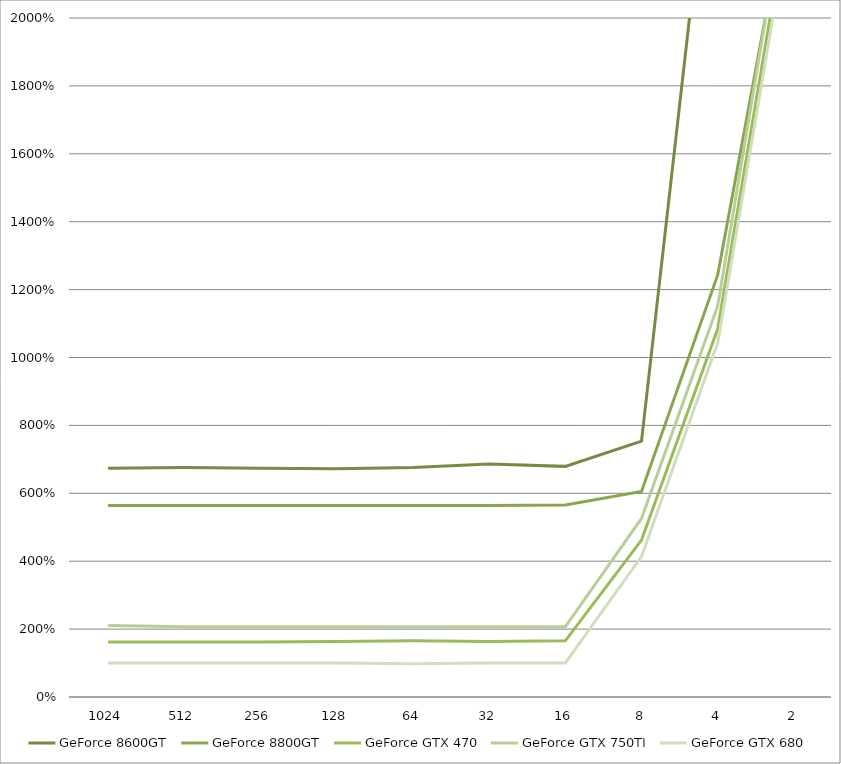
| Category | GeForce 8600GT | GeForce 8800GT | GeForce GTX 470 | GeForce GTX 750TI | GeForce GTX 680 |
|---|---|---|---|---|---|
| 1024.0 | 6.741 | 5.638 | 1.621 | 2.103 | 1 |
| 512.0 | 6.759 | 5.638 | 1.621 | 2.069 | 1 |
| 256.0 | 6.741 | 5.638 | 1.621 | 2.069 | 1 |
| 128.0 | 6.724 | 5.638 | 1.638 | 2.069 | 1 |
| 64.0 | 6.759 | 5.638 | 1.655 | 2.069 | 0.983 |
| 32.0 | 6.862 | 5.638 | 1.638 | 2.069 | 1 |
| 16.0 | 6.793 | 5.655 | 1.655 | 2.069 | 1 |
| 8.0 | 7.534 | 6.052 | 4.621 | 5.259 | 4.138 |
| 4.0 | 27.328 | 12.431 | 10.845 | 11.517 | 10.431 |
| 2.0 | 60.517 | 24.552 | 24.172 | 25 | 23.672 |